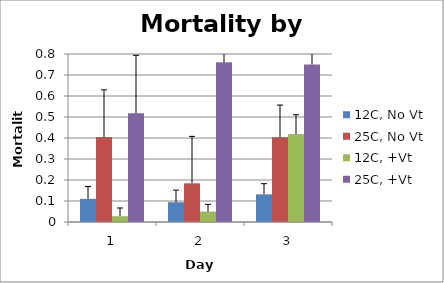
| Category | 12C, No Vt | 25C, No Vt | 12C, +Vt | 25C, +Vt |
|---|---|---|---|---|
| 0 | 0.11 | 0.405 | 0.027 | 0.518 |
| 1 | 0.094 | 0.184 | 0.05 | 0.76 |
| 2 | 0.132 | 0.403 | 0.419 | 0.751 |